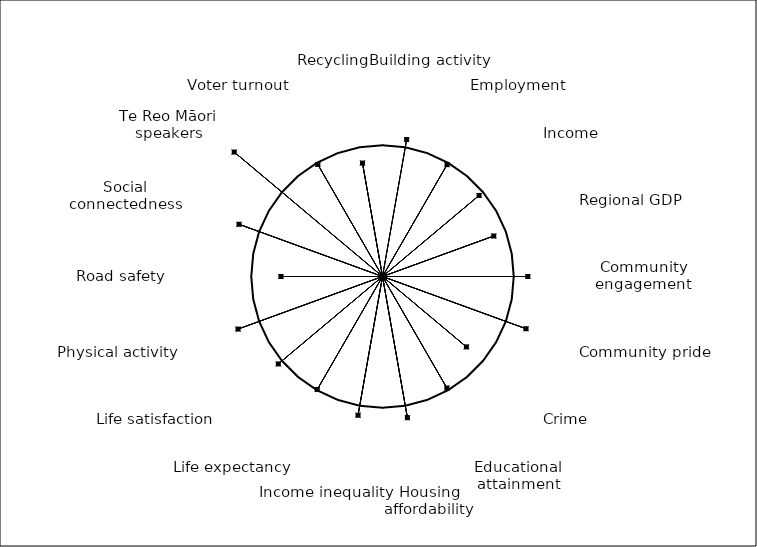
| Category | baseline | Waikato |
|---|---|---|
|  | 1 | 0 |
| Building activity | 1 | 1.06 |
|  | 1 | 0 |
| Employment | 1 | 0.984 |
|  | 1 | 0 |
| Income | 1 | 0.961 |
|  | 1 | 0 |
| Regional GDP | 1 | 0.902 |
|  | 1 | 0 |
| Community engagement | 1 | 1.107 |
|  | 1 | 0 |
| Community pride | 1 | 1.164 |
|  | 1 | 0 |
| Crime | 1 | 0.834 |
|  | 1 | 0 |
| Educational attainment | 1 | 0.981 |
|  | 1 | 0 |
| Housing affordability | 1 | 1.092 |
|  | 1 | 0 |
| Income inequality | 1 | 1.073 |
|  | 1 | 0 |
| Life expectancy | 1 | 0.994 |
|  | 1 | 0 |
| Life satisfaction | 1 | 1.036 |
|  | 1 | 0 |
| Physical activity | 1 | 1.171 |
|  | 1 | 0 |
| Road safety | 1 | 0.774 |
|  | 1 | 0 |
| Social connectedness | 1 | 1.163 |
|  | 1 | 0 |
| Te Reo Māori speakers | 1 | 1.475 |
|  | 1 | 0 |
| Voter turnout | 1 | 0.985 |
|  | 1 | 0 |
| Recycling | 1 | 0.878 |